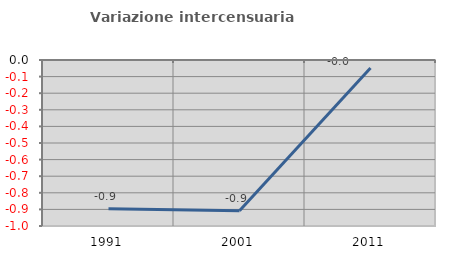
| Category | Variazione intercensuaria annua |
|---|---|
| 1991.0 | -0.896 |
| 2001.0 | -0.908 |
| 2011.0 | -0.049 |